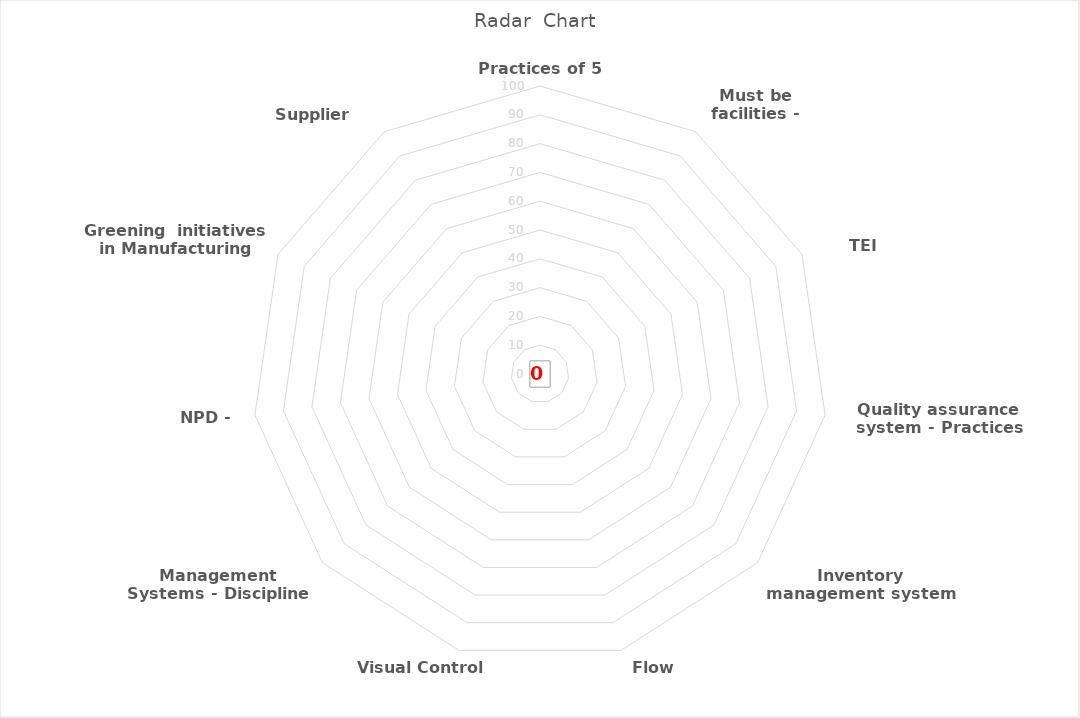
| Category | Series 0 |
|---|---|
| Practices of 5 S | 0 |
| Must be facilities - Current situation | 0 |
| TEI activities | 0 |
| Quality assurance system - Practices | 0 |
| Inventory management system | 0 |
| Flow manufacturing | 0 |
| Visual Control Systems  | 0 |
| Management Systems - Discipline | 0 |
| NPD - NPI | 0 |
| Greening  initiatives in Manufacturing | 0 |
| Supplier management | 0 |